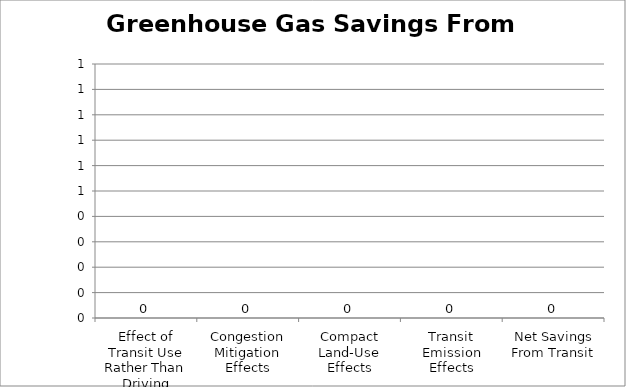
| Category | Greenhouse Gas Savings From Transit |
|---|---|
| Effect of Transit Use Rather Than Driving | 0 |
| Congestion Mitigation Effects | 0 |
| Compact Land-Use Effects | 0 |
| Transit Emission Effects | 0 |
| Net Savings From Transit | 0 |